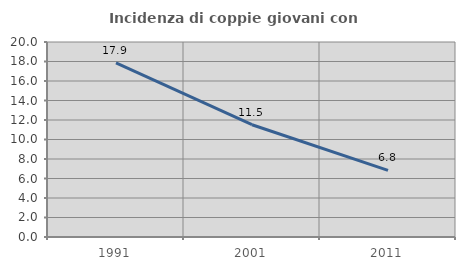
| Category | Incidenza di coppie giovani con figli |
|---|---|
| 1991.0 | 17.86 |
| 2001.0 | 11.515 |
| 2011.0 | 6.829 |